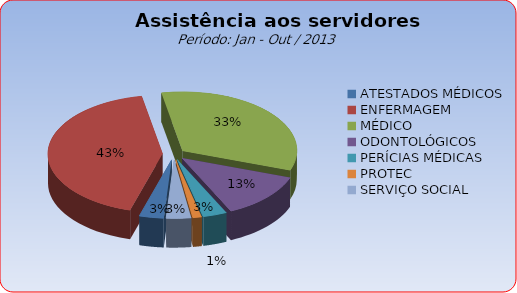
| Category | Series 0 |
|---|---|
| ATESTADOS MÉDICOS | 3.448 |
| ENFERMAGEM | 42.513 |
| MÉDICO | 33.338 |
| ODONTOLÓGICOS | 12.566 |
| PERÍCIAS MÉDICAS | 3.405 |
| PROTEC | 1.239 |
| SERVIÇO SOCIAL | 3.491 |